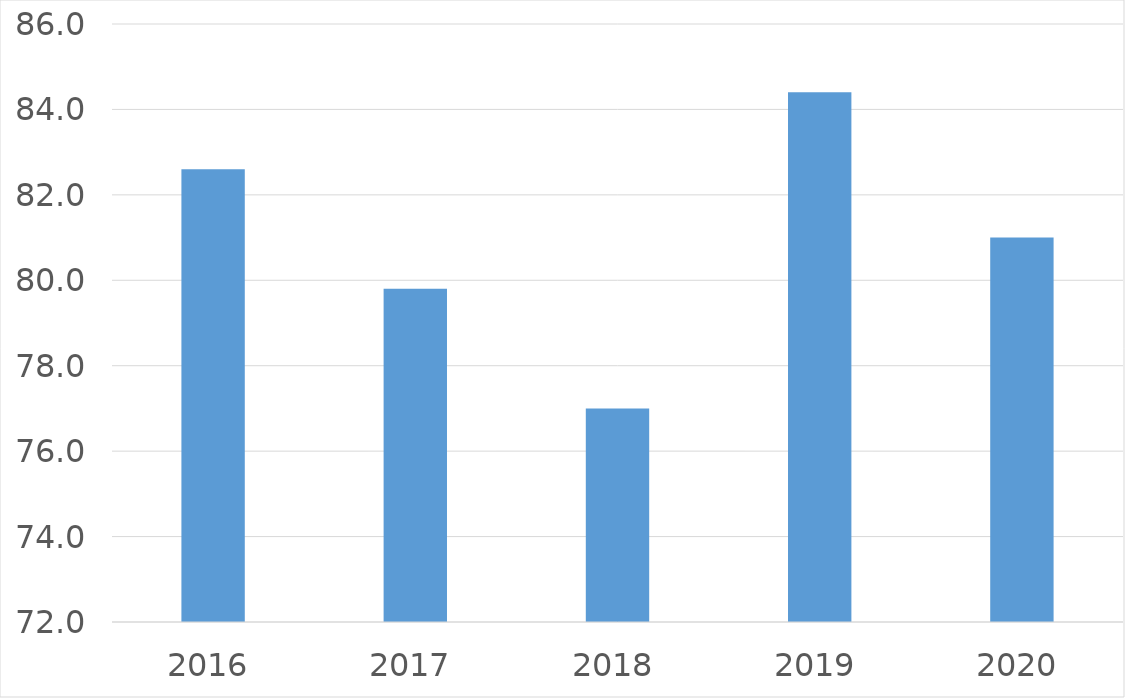
| Category | Series 0 |
|---|---|
| 2016 | 82.6 |
| 2017 | 79.8 |
| 2018 | 77 |
| 2019 | 84.4 |
| 2020 | 81 |